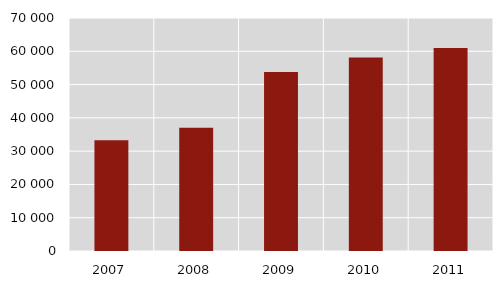
| Category | Series 1 |
|---|---|
| 2007.0 | 33251 |
| 2008.0 | 37016 |
| 2009.0 | 53769 |
| 2010.0 | 58147 |
| 2011.0 | 60966 |